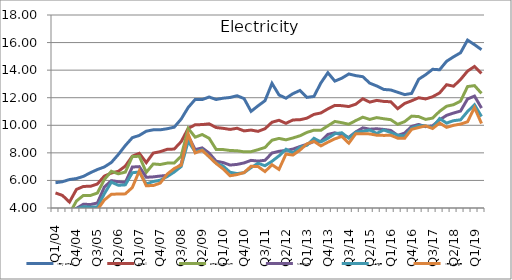
| Category | Very Small | Small | Small/Medium | Medium | Large | Very Large |
|---|---|---|---|---|---|---|
| Q1/04 | 5.835 | 5.092 | 3.754 | 3.303 | 3.141 | 2.761 |
| Q2/04 | 5.906 | 4.912 | 3.815 | 3.304 | 3.043 | 2.653 |
| Q3/04 | 6.065 | 4.429 | 3.593 | 3.386 | 3.392 | 2.929 |
| Q4/04  | 6.136 | 5.347 | 4.507 | 3.97 | 3.935 | 3.627 |
| Q1/05  | 6.295 | 5.566 | 4.915 | 4.274 | 4.097 | 3.635 |
| Q2/05  | 6.561 | 5.574 | 4.909 | 4.251 | 4.06 | 3.675 |
| Q3/05  | 6.791 | 5.744 | 5.087 | 4.363 | 4.075 | 3.881 |
| Q4/05  | 6.978 | 6.316 | 6.065 | 5.525 | 5.038 | 4.585 |
| Q1/06  | 7.304 | 6.537 | 6.663 | 5.984 | 5.878 | 4.996 |
| Q2/06  | 7.882 | 6.661 | 6.48 | 5.908 | 5.648 | 5.013 |
| Q3/06  | 8.531 | 7.043 | 6.603 | 5.85 | 5.679 | 5.026 |
| Q4/06  | 9.099 | 7.76 | 7.728 | 6.972 | 6.558 | 5.486 |
| Q1/07  | 9.265 | 7.966 | 7.753 | 7.002 | 6.613 | 6.691 |
| Q2/07  | 9.57 | 7.294 | 6.589 | 6.227 | 5.741 | 5.617 |
| Q3/07  | 9.671 | 7.985 | 7.197 | 6.258 | 5.921 | 5.629 |
| Q4/07  | 9.671 | 8.088 | 7.155 | 6.318 | 6.014 | 5.809 |
| Q1/08  | 9.75 | 8.257 | 7.257 | 6.366 | 6.281 | 6.461 |
| Q2/08  | 9.862 | 8.275 | 7.26 | 6.728 | 6.609 | 6.86 |
| Q3/08  | 10.453 | 8.815 | 7.757 | 7.175 | 7.01 | 7.109 |
| Q4/08  | 11.292 | 9.771 | 9.773 | 9.227 | 8.841 | 9.362 |
| Q1/09  | 11.874 | 10.039 | 9.136 | 8.237 | 8.077 | 7.998 |
| Q2/09  | 11.864 | 10.051 | 9.329 | 8.359 | 8.228 | 8.183 |
| Q3/09  | 12.051 | 10.106 | 9.058 | 7.984 | 7.729 | 7.722 |
| Q4/09  | 11.87 | 9.837 | 8.25 | 7.396 | 7.257 | 7.23 |
| Q1/10  | 11.965 | 9.78 | 8.24 | 7.297 | 7.043 | 6.834 |
| Q2/10  | 12.017 | 9.7 | 8.171 | 7.115 | 6.593 | 6.338 |
| Q3/10  | 12.142 | 9.785 | 8.154 | 7.163 | 6.497 | 6.425 |
| Q4/10  | 11.938 | 9.593 | 8.072 | 7.269 | 6.561 | 6.569 |
| Q1/11  | 11.01 | 9.654 | 8.085 | 7.456 | 6.927 | 7.026 |
| Q2/11  | 11.409 | 9.56 | 8.229 | 7.402 | 7.24 | 7.006 |
| Q3/11  | 11.785 | 9.751 | 8.393 | 7.46 | 7.07 | 6.642 |
| Q4/11  | 13.043 | 10.222 | 8.917 | 7.989 | 7.39 | 7.139 |
| Q1/12  | 12.203 | 10.363 | 9.048 | 8.113 | 7.779 | 6.8 |
| Q2/12  | 11.964 | 10.14 | 8.945 | 8.176 | 8.263 | 7.908 |
| Q3/12  | 12.296 | 10.388 | 9.08 | 8.275 | 7.99 | 7.839 |
| Q4/12  | 12.525 | 10.401 | 9.238 | 8.456 | 8.409 | 8.197 |
| Q1/13  | 12.026 | 10.516 | 9.482 | 8.621 | 8.552 | 8.654 |
| Q2/13  | 12.09 | 10.789 | 9.647 | 8.823 | 9.058 | 8.836 |
| Q3/13  | 13.071 | 10.894 | 9.634 | 8.824 | 8.795 | 8.505 |
| Q4/13  | 13.813 | 11.189 | 9.959 | 9.338 | 9.055 | 8.773 |
| Q1/14  | 13.204 | 11.444 | 10.279 | 9.456 | 9.387 | 9.018 |
| Q2/14  | 13.416 | 11.424 | 10.188 | 9.298 | 9.457 | 9.189 |
| Q3/14  | 13.723 | 11.359 | 10.076 | 9.121 | 9.062 | 8.702 |
| Q4/14  | 13.601 | 11.532 | 10.342 | 9.521 | 9.503 | 9.393 |
| Q1/15  | 13.526 | 11.924 | 10.587 | 9.814 | 9.558 | 9.395 |
| Q2/15  | 13.056 | 11.681 | 10.424 | 9.717 | 9.655 | 9.374 |
| Q3/15  | 12.851 | 11.806 | 10.559 | 9.748 | 9.412 | 9.279 |
| Q4/15  | 12.6 | 11.731 | 10.474 | 9.699 | 9.659 | 9.267 |
| Q1/16  | 12.562 | 11.707 | 10.406 | 9.627 | 9.477 | 9.273 |
| Q2/16  | 12.394 | 11.207 | 10.07 | 9.267 | 9.275 | 9.067 |
| Q3/16  | 12.225 | 11.585 | 10.267 | 9.438 | 9.226 | 9.061 |
| Q4/16  | 12.313 | 11.779 | 10.665 | 9.921 | 9.794 | 9.707 |
| Q1/17  | 13.339 | 11.997 | 10.63 | 10.062 | 9.975 | 9.837 |
| Q2/17  | 13.668 | 11.911 | 10.426 | 9.901 | 9.957 | 9.958 |
| Q3/17  | 14.062 | 12.069 | 10.521 | 9.961 | 9.835 | 9.766 |
| Q4/17  | 14.028 | 12.348 | 11.013 | 10.395 | 10.489 | 10.165 |
| Q1/18  | 14.644 | 12.942 | 11.382 | 10.719 | 10.161 | 9.849 |
| Q2/18  | 14.968 | 12.836 | 11.495 | 10.888 | 10.334 | 9.996 |
| Q3/18  | 15.262 | 13.32 | 11.754 | 11.034 | 10.394 | 10.088 |
| Q4/18  | 16.18 | 13.932 | 12.809 | 11.908 | 10.998 | 10.257 |
| Q1/19  | 15.847 | 14.269 | 12.877 | 12.118 | 11.489 | 11.282 |
| Q2/19  | 15.486 | 13.758 | 12.312 | 11.248 | 10.638 | 10.127 |